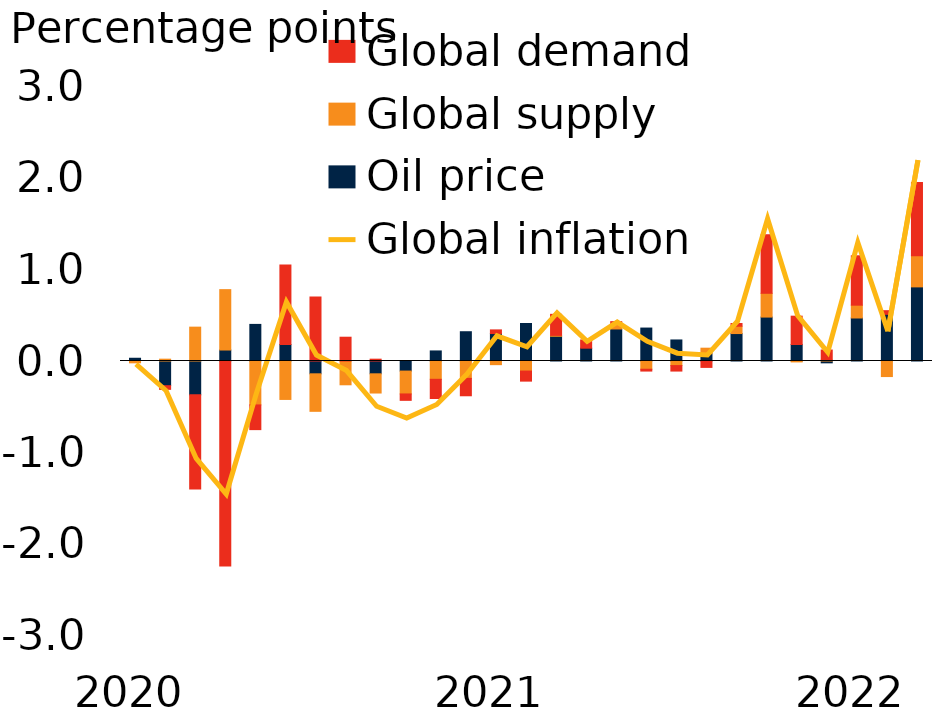
| Category | Oil price | Global supply | Global demand |
|---|---|---|---|
| 2020 | 0.03 | -0.02 | 0 |
| 2020m2 | -0.27 | 0.02 | -0.04 |
| 2020m3 | -0.37 | 0.37 | -1.03 |
| 2020m4 | 0.12 | 0.66 | -2.24 |
| 2020m5 | 0.4 | -0.48 | -0.27 |
| 2020m6 | 0.18 | -0.42 | 0.87 |
| 2020m7 | -0.14 | -0.41 | 0.7 |
| 2020m8 | 0 | -0.26 | 0.26 |
| 2020m9 | -0.14 | -0.21 | 0.02 |
| 2020m10 | -0.11 | -0.25 | -0.07 |
| 2020m11 | 0.11 | -0.2 | -0.21 |
| 2020m12 | 0.32 | -0.19 | -0.19 |
| 2021 | 0.3 | -0.04 | 0.04 |
| 2021m2 | 0.41 | -0.11 | -0.11 |
| 2021m3 | 0.27 | 0.01 | 0.23 |
| 2021m4 | 0.14 | 0 | 0.09 |
| 2021m5 | 0.35 | 0.05 | 0.03 |
| 2021m6 | 0.36 | -0.09 | -0.02 |
| 2021m7 | 0.23 | -0.05 | -0.06 |
| 2021m8 | 0.08 | 0.06 | -0.07 |
| 2021m9 | 0.3 | 0.08 | 0.03 |
| 2021m10 | 0.48 | 0.26 | 0.64 |
| 2021m11 | 0.18 | -0.01 | 0.31 |
| 2021m12 | -0.02 | 0.01 | 0.11 |
| 2022 | 0.47 | 0.14 | 0.54 |
| 2022m2 | 0.51 | -0.17 | 0.04 |
| 2022m3 | 0.81 | 0.34 | 0.8 |